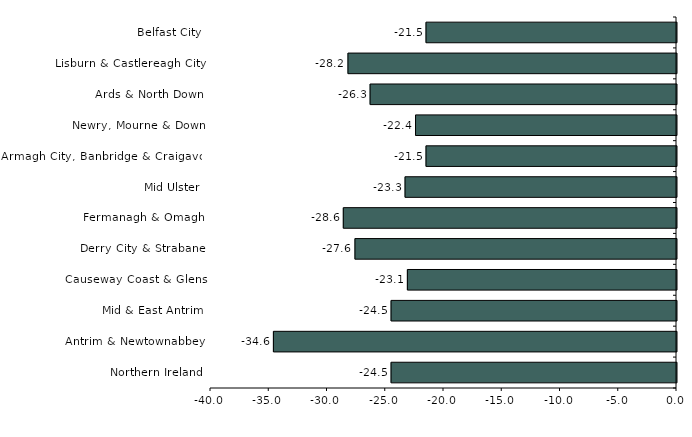
| Category | Series 0 |
|---|---|
| Belfast City | -21.5 |
| Lisburn & Castlereagh City | -28.2 |
| Ards & North Down | -26.3 |
| Newry, Mourne & Down | -22.4 |
| Armagh City, Banbridge & Craigavon | -21.5 |
| Mid Ulster | -23.3 |
| Fermanagh & Omagh | -28.6 |
| Derry City & Strabane | -27.6 |
| Causeway Coast & Glens | -23.1 |
| Mid & East Antrim | -24.5 |
| Antrim & Newtownabbey | -34.6 |
| Northern Ireland | -24.5 |